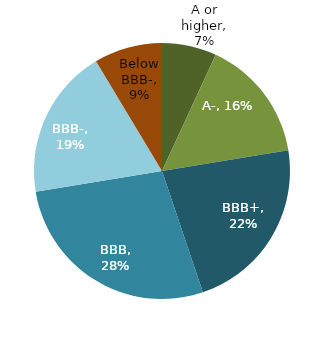
| Category | Series 0 |
|---|---|
| A or higher | 0.069 |
| A- | 0.155 |
| BBB+ | 0.224 |
| BBB | 0.276 |
| BBB- | 0.19 |
| Below BBB- | 0.086 |